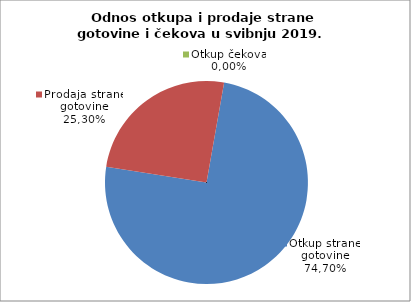
| Category | Otkup strane gotovine |
|---|---|
| 0 | 74.698 |
| 1 | 25.302 |
| 2 | 0 |